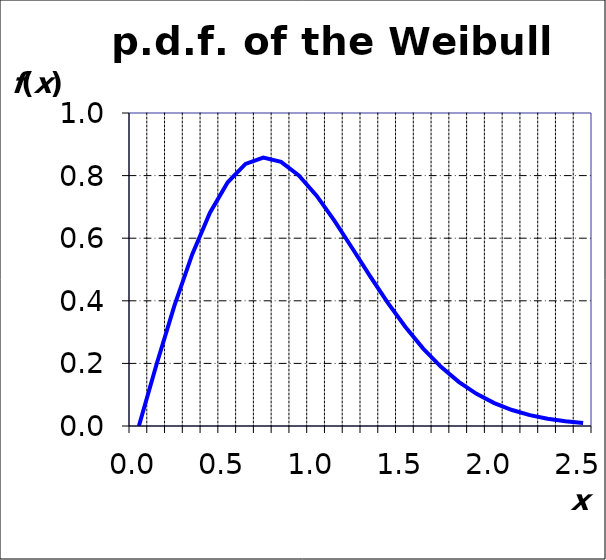
| Category | f(x) |
|---|---|
| 0.0 | 0 |
| 0.1 | 0.198 |
| 0.2 | 0.384 |
| 0.30000000000000004 | 0.548 |
| 0.4 | 0.682 |
| 0.5 | 0.779 |
| 0.6 | 0.837 |
| 0.7 | 0.858 |
| 0.7999999999999999 | 0.844 |
| 0.8999999999999999 | 0.801 |
| 0.9999999999999999 | 0.736 |
| 1.0999999999999999 | 0.656 |
| 1.2 | 0.569 |
| 1.3 | 0.48 |
| 1.4000000000000001 | 0.394 |
| 1.5000000000000002 | 0.316 |
| 1.6000000000000003 | 0.247 |
| 1.7000000000000004 | 0.189 |
| 1.8000000000000005 | 0.141 |
| 1.9000000000000006 | 0.103 |
| 2.0000000000000004 | 0.073 |
| 2.1000000000000005 | 0.051 |
| 2.2000000000000006 | 0.035 |
| 2.3000000000000007 | 0.023 |
| 2.400000000000001 | 0.015 |
| 2.500000000000001 | 0.01 |